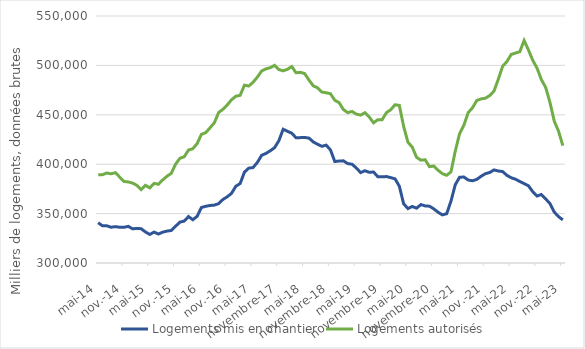
| Category | Logements mis en chantier | Logements autorisés |
|---|---|---|
| 2014-05-01 | 340800 | 389300 |
| 2014-06-01 | 337600 | 389300 |
| 2014-07-01 | 337700 | 391100 |
| 2014-08-01 | 336200 | 390300 |
| 2014-09-01 | 336800 | 391400 |
| 2014-10-01 | 336200 | 387000 |
| 2014-11-01 | 336100 | 382600 |
| 2014-12-01 | 337100 | 382000 |
| 2015-01-01 | 334600 | 380900 |
| 2015-02-01 | 335000 | 378600 |
| 2015-03-01 | 334700 | 374300 |
| 2015-04-01 | 331400 | 378600 |
| 2015-05-01 | 328900 | 376000 |
| 2015-06-01 | 331300 | 380600 |
| 2015-07-01 | 329300 | 379700 |
| 2015-08-01 | 331200 | 384100 |
| 2015-09-01 | 332300 | 387800 |
| 2015-10-01 | 332900 | 390800 |
| 2015-11-01 | 337200 | 400100 |
| 2015-12-01 | 341400 | 406000 |
| 2016-01-01 | 342400 | 407500 |
| 2016-02-01 | 347000 | 414300 |
| 2016-03-01 | 343800 | 415700 |
| 2016-04-01 | 347200 | 420800 |
| 2016-05-01 | 356200 | 430200 |
| 2016-06-01 | 357400 | 431900 |
| 2016-07-01 | 358200 | 436800 |
| 2016-08-01 | 358600 | 442000 |
| 2016-09-01 | 360100 | 452300 |
| 2016-10-01 | 364300 | 455600 |
| 2016-11-01 | 367000 | 460000 |
| 2016-12-01 | 370500 | 465200 |
| 2017-01-01 | 377700 | 468800 |
| 2017-02-01 | 380400 | 469700 |
| 2017-03-01 | 392000 | 480000 |
| 2017-04-01 | 396000 | 479100 |
| 2017-05-01 | 396600 | 482900 |
| 2017-06-01 | 401800 | 488100 |
| 2017-07-01 | 409000 | 494400 |
| 2017-08-01 | 410900 | 496500 |
| 2017-09-01 | 413600 | 497700 |
| 2017-10-01 | 416700 | 500000 |
| 2017-11-01 | 423800 | 495800 |
| 2017-12-01 | 435400 | 494500 |
| 2018-01-01 | 433300 | 496100 |
| 2018-02-01 | 431400 | 498800 |
| 2018-03-01 | 426700 | 492500 |
| 2018-04-01 | 426900 | 493000 |
| 2018-05-01 | 427100 | 491700 |
| 2018-06-01 | 426400 | 485200 |
| 2018-07-01 | 422500 | 479300 |
| 2018-08-01 | 420200 | 477300 |
| 2018-09-01 | 418100 | 473000 |
| 2018-10-01 | 419300 | 472300 |
| 2018-11-01 | 414400 | 471300 |
| 2018-12-01 | 402700 | 464700 |
| 2019-01-01 | 403200 | 462300 |
| 2019-02-01 | 403400 | 455300 |
| 2019-03-01 | 400600 | 452200 |
| 2019-04-01 | 400000 | 453400 |
| 2019-05-01 | 396200 | 450700 |
| 2019-06-01 | 391500 | 449700 |
| 2019-07-01 | 393400 | 452100 |
| 2019-08-01 | 391800 | 447800 |
| 2019-09-01 | 392100 | 441900 |
| 2019-10-01 | 387300 | 445000 |
| 2019-11-01 | 387200 | 445000 |
| 2019-12-01 | 387500 | 452200 |
| 2020-01-01 | 386400 | 455100 |
| 2020-02-01 | 385200 | 460200 |
| 2020-03-01 | 377700 | 459500 |
| 2020-04-01 | 359900 | 438200 |
| 2020-05-01 | 355100 | 422200 |
| 2020-06-01 | 357200 | 417300 |
| 2020-07-01 | 355500 | 407000 |
| 2020-08-01 | 359100 | 404100 |
| 2020-09-01 | 357800 | 404500 |
| 2020-10-01 | 357500 | 397500 |
| 2020-11-01 | 354800 | 398200 |
| 2020-12-01 | 351400 | 393900 |
| 2021-01-01 | 348700 | 390400 |
| 2021-02-01 | 349900 | 388800 |
| 2021-03-01 | 362600 | 392200 |
| 2021-04-01 | 379300 | 413300 |
| 2021-05-01 | 386800 | 430900 |
| 2021-06-01 | 387000 | 439500 |
| 2021-07-01 | 384000 | 452200 |
| 2021-08-01 | 383200 | 457100 |
| 2021-09-01 | 384600 | 464500 |
| 2021-10-01 | 387800 | 466100 |
| 2021-11-01 | 390400 | 466800 |
| 2021-12-01 | 391600 | 469500 |
| 2022-01-01 | 394200 | 474000 |
| 2022-02-01 | 393100 | 486000 |
| 2022-03-01 | 392600 | 499100 |
| 2022-04-01 | 388700 | 503900 |
| 2022-05-01 | 386300 | 511100 |
| 2022-06-01 | 384800 | 512500 |
| 2022-07-01 | 382500 | 513900 |
| 2022-08-01 | 380300 | 525200 |
| 2022-09-01 | 378200 | 515700 |
| 2022-10-01 | 372200 | 505200 |
| 2022-11-01 | 367800 | 497300 |
| 2022-12-01 | 369300 | 485700 |
| 2023-01-01 | 364900 | 477800 |
| 2023-02-01 | 360200 | 462600 |
| 2023-03-01 | 351600 | 443600 |
| 2023-04-01 | 346900 | 433400 |
| 2023-05-01 | 343600 | 418800 |